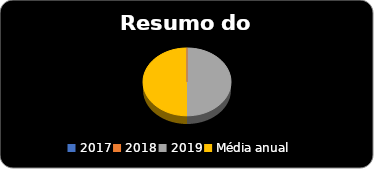
| Category | Series 0 |
|---|---|
| 2017 | 0 |
| 2018 | 0 |
| 2019 | 210285.56 |
| Média anual  | 210285.56 |